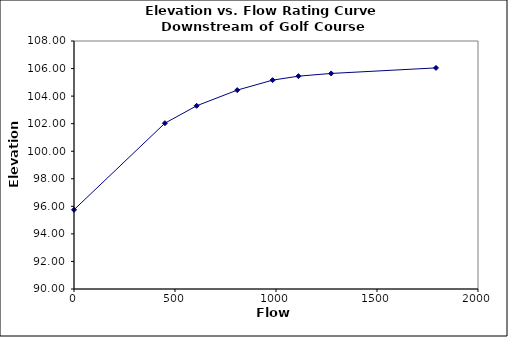
| Category | Series 0 |
|---|---|
| 0.0 | 95.75 |
| 450.0 | 102.034 |
| 607.0 | 103.295 |
| 808.0 | 104.435 |
| 983.0 | 105.159 |
| 1111.0 | 105.448 |
| 1273.0 | 105.645 |
| 1792.0 | 106.048 |